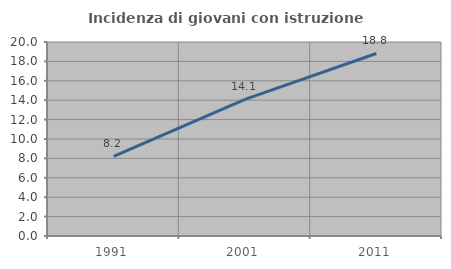
| Category | Incidenza di giovani con istruzione universitaria |
|---|---|
| 1991.0 | 8.21 |
| 2001.0 | 14.078 |
| 2011.0 | 18.817 |